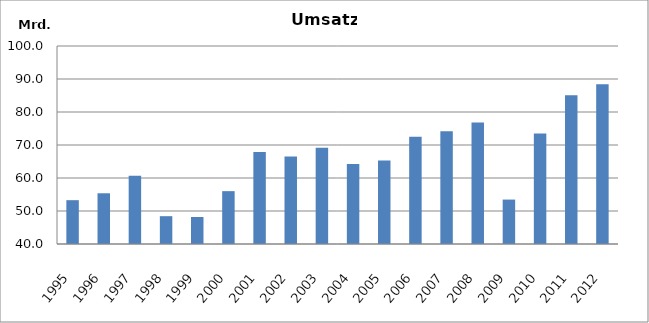
| Category | 1995 1996 1997 1998 1999 2000 2001 2002 2003 2004 2005 2006 2007 2008 2009 2010 2011 2012 |
|---|---|
| 1995 | 53278763 |
| 1996 | 55371956 |
| 1997 | 60710454 |
| 1998 | 48430705 |
| 1999 | 48190293 |
| 2000 | 56014702 |
| 2001 | 67861795 |
| 2002 | 66481294 |
| 2003 | 69161973 |
| 2004 | 64266307 |
| 2005 | 65293897 |
| 2006 | 72514648 |
| 2007 | 74176770 |
| 2008 | 76788139 |
| 2009 | 53462495 |
| 2010 | 73497409.496 |
| 2011 | 85064473 |
| 2012 | 88419481 |